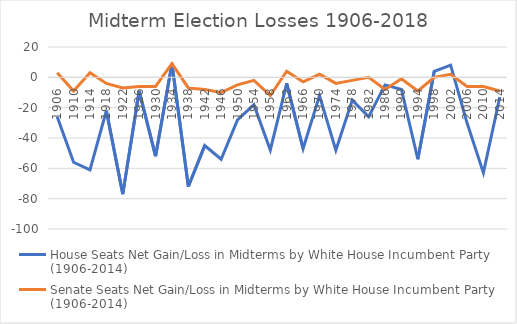
| Category | House Seats Net Gain/Loss in Midterms by White House Incumbent Party (1906-2014) | Senate Seats Net Gain/Loss in Midterms by White House Incumbent Party (1906-2014) |
|---|---|---|
| 1906.0 | -26 | 3 |
| 1910.0 | -56 | -9 |
| 1914.0 | -61 | 3 |
| 1918.0 | -22 | -4 |
| 1922.0 | -77 | -7 |
| 1926.0 | -9 | -6 |
| 1930.0 | -52 | -6 |
| 1934.0 | 9 | 9 |
| 1938.0 | -72 | -7 |
| 1942.0 | -45 | -8 |
| 1946.0 | -54 | -10 |
| 1950.0 | -28 | -5 |
| 1954.0 | -18 | -2 |
| 1958.0 | -48 | -12 |
| 1962.0 | -4 | 4 |
| 1966.0 | -47 | -3 |
| 1970.0 | -12 | 2 |
| 1974.0 | -48 | -4 |
| 1978.0 | -15 | -2 |
| 1982.0 | -26 | 0 |
| 1986.0 | -5 | -8 |
| 1990.0 | -8 | -1 |
| 1994.0 | -54 | -9 |
| 1998.0 | 4 | 0 |
| 2002.0 | 8 | 2 |
| 2006.0 | -30 | -6 |
| 2010.0 | -63 | -6 |
| 2014.0 | -13 | -9 |